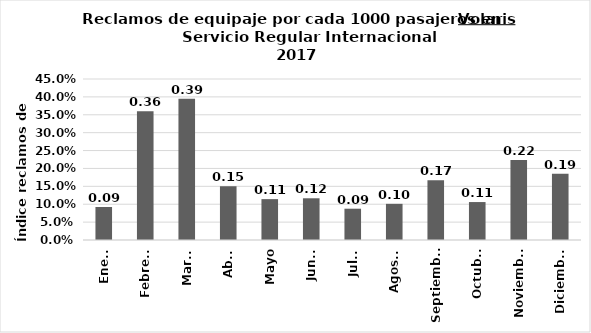
| Category | Reclamos por cada 1000 pasajeros |
|---|---|
| Enero | 0.092 |
| Febrero | 0.36 |
| Marzo | 0.394 |
| Abril | 0.15 |
| Mayo | 0.114 |
| Junio | 0.117 |
| Julio | 0.087 |
| Agosto | 0.101 |
| Septiembre | 0.167 |
| Octubre | 0.106 |
| Noviembre | 0.224 |
| Diciembre | 0.185 |